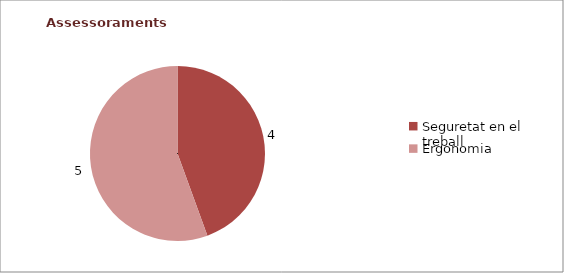
| Category | Series 0 |
|---|---|
| Seguretat en el treball | 4 |
| Ergonomia | 5 |